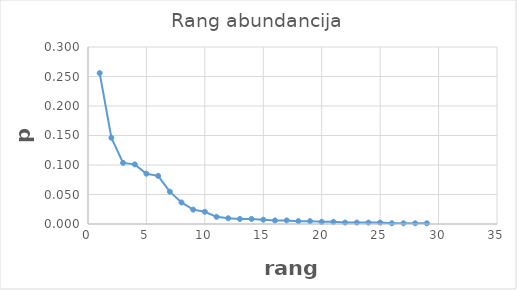
| Category | Series 0 |
|---|---|
| 1.0 | 0.256 |
| 2.0 | 0.146 |
| 3.0 | 0.104 |
| 4.0 | 0.101 |
| 5.0 | 0.085 |
| 6.0 | 0.082 |
| 7.0 | 0.055 |
| 8.0 | 0.037 |
| 9.0 | 0.024 |
| 10.0 | 0.021 |
| 11.0 | 0.012 |
| 12.0 | 0.01 |
| 13.0 | 0.009 |
| 14.0 | 0.009 |
| 15.0 | 0.007 |
| 16.0 | 0.006 |
| 17.0 | 0.006 |
| 18.0 | 0.005 |
| 19.0 | 0.005 |
| 20.0 | 0.004 |
| 21.0 | 0.004 |
| 22.0 | 0.002 |
| 23.0 | 0.002 |
| 24.0 | 0.002 |
| 25.0 | 0.002 |
| 26.0 | 0.001 |
| 27.0 | 0.001 |
| 28.0 | 0.001 |
| 29.0 | 0.001 |